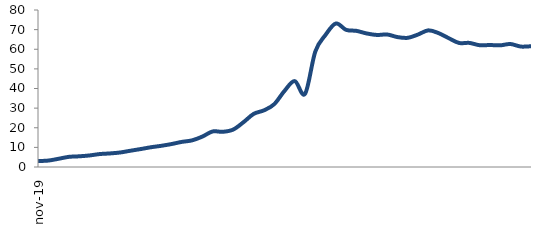
| Category | Series 0 |
|---|---|
| 2019-11-01 | 3.019 |
| 2019-12-01 | 3.273 |
| 2020-01-01 | 4.186 |
| 2020-02-01 | 5.17 |
| 2020-03-01 | 5.444 |
| 2020-04-01 | 5.874 |
| 2020-05-01 | 6.591 |
| 2020-06-01 | 6.913 |
| 2020-07-01 | 7.395 |
| 2020-08-01 | 8.292 |
| 2020-09-01 | 9.145 |
| 2020-10-01 | 10.067 |
| 2020-11-01 | 10.794 |
| 2020-12-01 | 11.695 |
| 2021-01-01 | 12.796 |
| 2021-02-01 | 13.569 |
| 2021-03-01 | 15.494 |
| 2021-04-01 | 18.102 |
| 2021-05-01 | 17.933 |
| 2021-06-01 | 19.058 |
| 2021-07-01 | 22.799 |
| 2021-08-01 | 27.071 |
| 2021-09-01 | 28.872 |
| 2021-10-01 | 32.01 |
| 2021-11-01 | 38.771 |
| 2021-12-01 | 43.773 |
| 2022-01-01 | 37.28 |
| 2022-02-01 | 58.857 |
| 2022-03-01 | 67.349 |
| 2022-04-01 | 73.13 |
| 2022-05-01 | 69.874 |
| 2022-06-01 | 69.376 |
| 2022-07-01 | 68.04 |
| 2022-08-01 | 67.278 |
| 2022-09-01 | 67.518 |
| 2022-10-01 | 66.201 |
| 2022-11-01 | 65.824 |
| 2022-12-01 | 67.5 |
| 2023-01-01 | 69.621 |
| 2023-02-01 | 68.213 |
| 2023-03-01 | 65.618 |
| 2023-04-01 | 63.206 |
| 2023-05-01 | 63.235 |
| 2023-06-01 | 62.047 |
| 2023-07-01 | 62.154 |
| 2023-08-01 | 61.989 |
| 2023-09-01 | 62.663 |
| 2023-10-01 | 61.376 |
| 2023-11-01 | 61.533 |